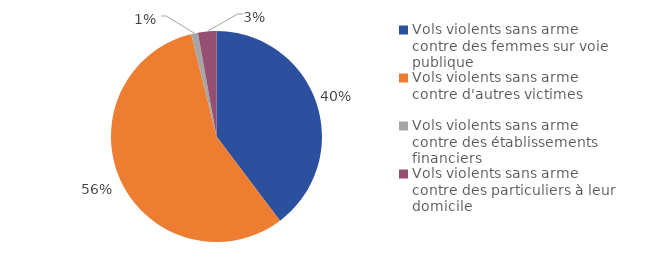
| Category | Series 0 |
|---|---|
| Vols violents sans arme contre des femmes sur voie publique | 24665 |
| Vols violents sans arme contre d'autres victimes | 35046 |
| Vols violents sans arme contre des établissements financiers | 643 |
| Vols violents sans arme contre des particuliers à leur domicile | 1750 |